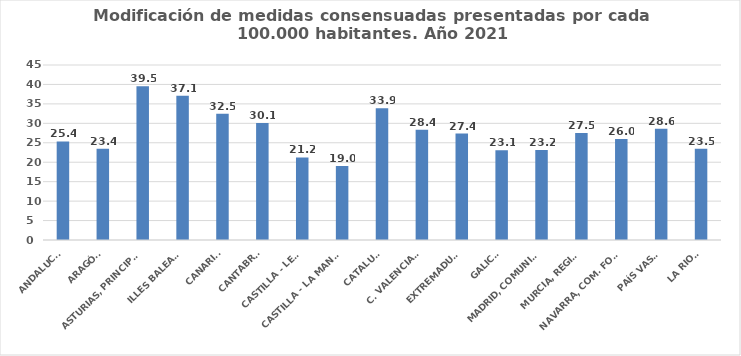
| Category | Series 0 |
|---|---|
| ANDALUCÍA | 25.352 |
| ARAGÓN | 23.449 |
| ASTURIAS, PRINCIPADO | 39.534 |
| ILLES BALEARS | 37.084 |
| CANARIAS | 32.49 |
| CANTABRIA | 30.111 |
| CASTILLA - LEÓN | 21.233 |
| CASTILLA - LA MANCHA | 19.028 |
| CATALUÑA | 33.89 |
| C. VALENCIANA | 28.37 |
| EXTREMADURA | 27.371 |
| GALICIA | 23.074 |
| MADRID, COMUNIDAD | 23.166 |
| MURCIA, REGIÓN | 27.527 |
| NAVARRA, COM. FORAL | 26 |
| PAÍS VASCO | 28.591 |
| LA RIOJA | 23.452 |